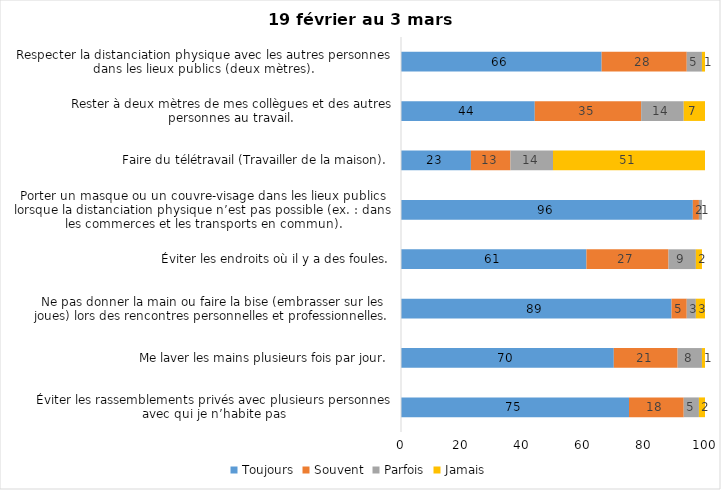
| Category | Toujours | Souvent | Parfois | Jamais |
|---|---|---|---|---|
| Éviter les rassemblements privés avec plusieurs personnes avec qui je n’habite pas | 75 | 18 | 5 | 2 |
| Me laver les mains plusieurs fois par jour. | 70 | 21 | 8 | 1 |
| Ne pas donner la main ou faire la bise (embrasser sur les joues) lors des rencontres personnelles et professionnelles. | 89 | 5 | 3 | 3 |
| Éviter les endroits où il y a des foules. | 61 | 27 | 9 | 2 |
| Porter un masque ou un couvre-visage dans les lieux publics lorsque la distanciation physique n’est pas possible (ex. : dans les commerces et les transports en commun). | 96 | 2 | 1 | 0 |
| Faire du télétravail (Travailler de la maison). | 23 | 13 | 14 | 51 |
| Rester à deux mètres de mes collègues et des autres personnes au travail. | 44 | 35 | 14 | 7 |
| Respecter la distanciation physique avec les autres personnes dans les lieux publics (deux mètres). | 66 | 28 | 5 | 1 |